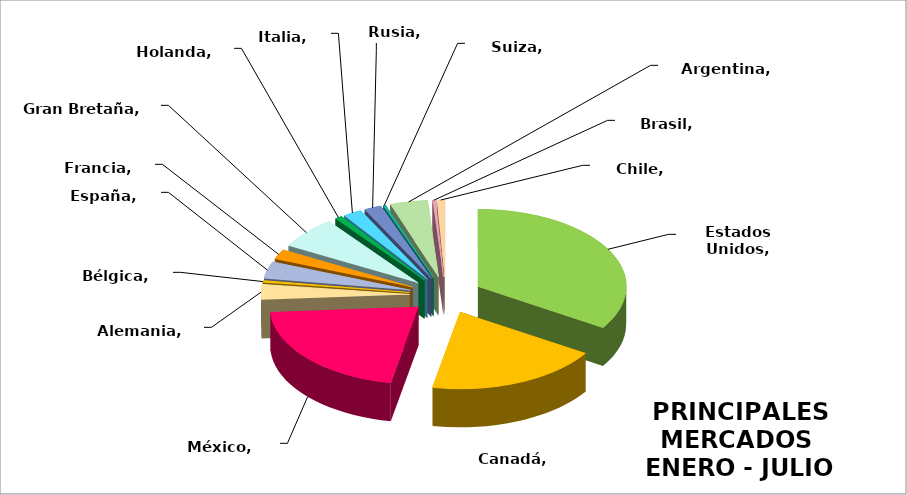
| Category | Series 0 |
|---|---|
| Estados Unidos | 0.327 |
| Canadá | 0.182 |
| México | 0.201 |
| Alemania | 0.031 |
| Bélgica | 0.004 |
| España | 0.034 |
| Francia | 0.02 |
| Gran Bretaña | 0.064 |
| Holanda | 0.008 |
| Italia | 0.02 |
| Rusia | 0.018 |
| Suiza | 0.003 |
| Argentina | 0.039 |
| Brasil | 0.003 |
| Chile | 0.008 |